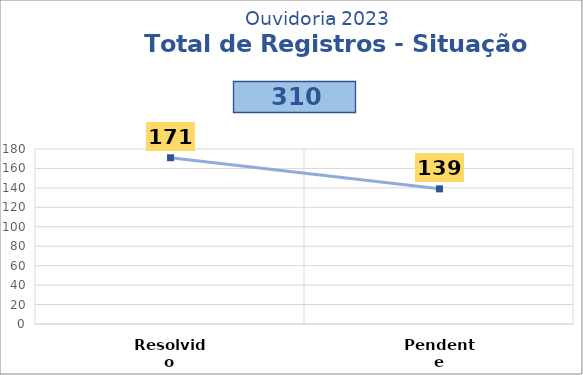
| Category | Series 2 |
|---|---|
| Resolvido | 171 |
| Pendente | 139 |